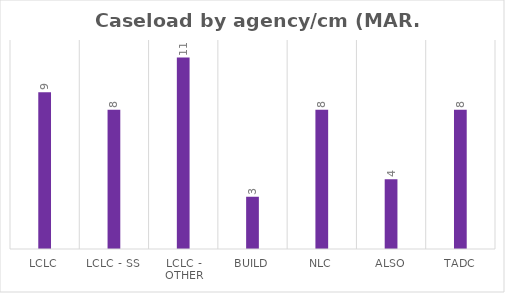
| Category | Series 0 |
|---|---|
| LCLC | 9 |
| LCLC - SS | 8 |
| LCLC - Other | 11 |
| BUILD | 3 |
| NLC | 8 |
| ALSO | 4 |
| TADC | 8 |